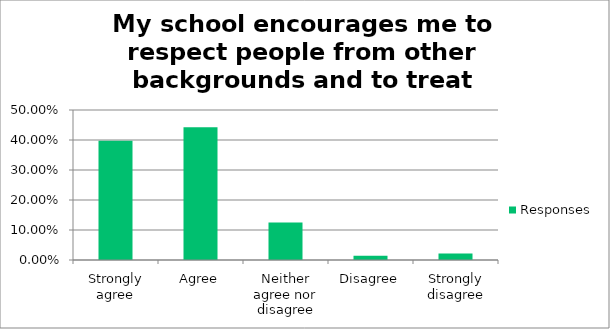
| Category | Responses |
|---|---|
| Strongly agree | 0.398 |
| Agree | 0.442 |
| Neither agree nor disagree | 0.125 |
| Disagree | 0.014 |
| Strongly disagree | 0.021 |